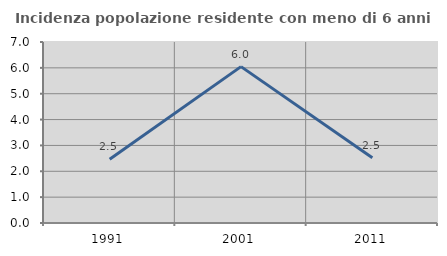
| Category | Incidenza popolazione residente con meno di 6 anni |
|---|---|
| 1991.0 | 2.467 |
| 2001.0 | 6.048 |
| 2011.0 | 2.525 |